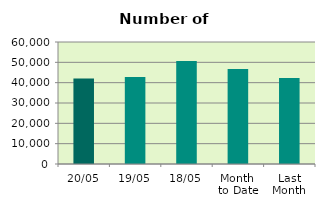
| Category | Series 0 |
|---|---|
| 20/05 | 42006 |
| 19/05 | 42726 |
| 18/05 | 50662 |
| Month 
to Date | 46671.857 |
| Last
Month | 42252.3 |